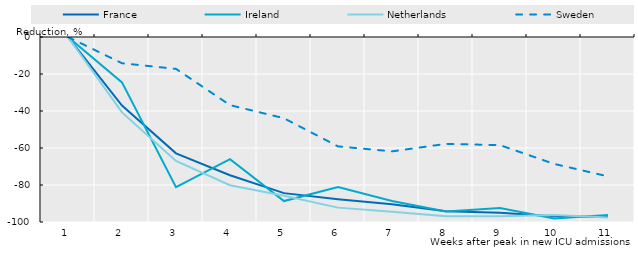
| Category | France | Ireland | Netherlands | Sweden |
|---|---|---|---|---|
| 0 | 0 | 0 | 0 | 0 |
| 1 | -37.072 | -24.528 | -40.777 | -14.189 |
| 2 | -62.885 | -81.132 | -66.99 | -17.23 |
| 3 | -74.704 | -66.038 | -80.097 | -36.824 |
| 4 | -84.392 | -88.679 | -85.761 | -43.919 |
| 5 | -87.729 | -81.132 | -92.233 | -59.122 |
| 6 | -90.463 | -88.679 | -94.498 | -61.824 |
| 7 | -94.23 | -94.34 | -96.926 | -57.77 |
| 8 | -95.005 | -92.453 | -96.926 | -58.446 |
| 9 | -96.921 | -98.113 | -96.278 | -68.581 |
| 10 | -97.352 | -96.226 | -97.573 | -75.338 |